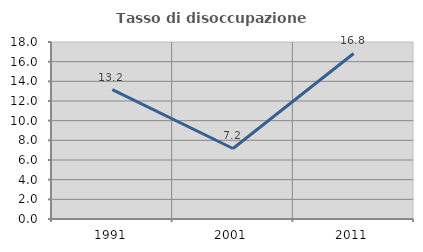
| Category | Tasso di disoccupazione giovanile  |
|---|---|
| 1991.0 | 13.151 |
| 2001.0 | 7.171 |
| 2011.0 | 16.832 |